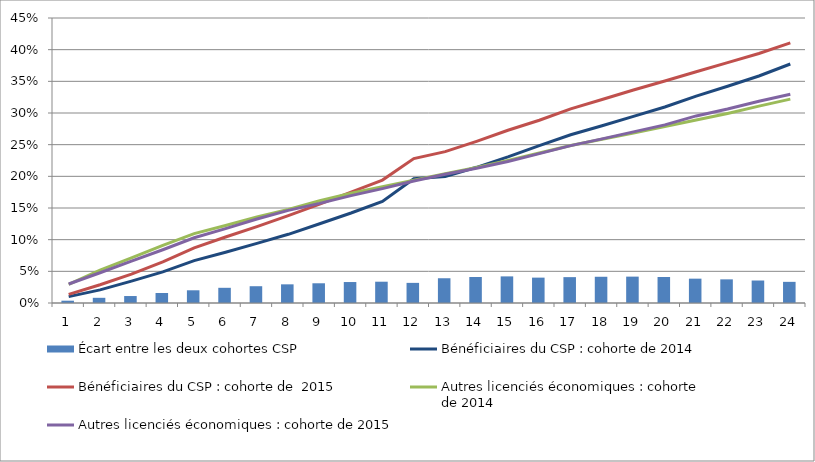
| Category | Écart entre les deux cohortes CSP |
|---|---|
| 0 | 0.004 |
| 1 | 0.008 |
| 2 | 0.011 |
| 3 | 0.016 |
| 4 | 0.02 |
| 5 | 0.024 |
| 6 | 0.027 |
| 7 | 0.029 |
| 8 | 0.031 |
| 9 | 0.033 |
| 10 | 0.034 |
| 11 | 0.032 |
| 12 | 0.039 |
| 13 | 0.041 |
| 14 | 0.042 |
| 15 | 0.04 |
| 16 | 0.041 |
| 17 | 0.041 |
| 18 | 0.042 |
| 19 | 0.041 |
| 20 | 0.038 |
| 21 | 0.037 |
| 22 | 0.036 |
| 23 | 0.033 |